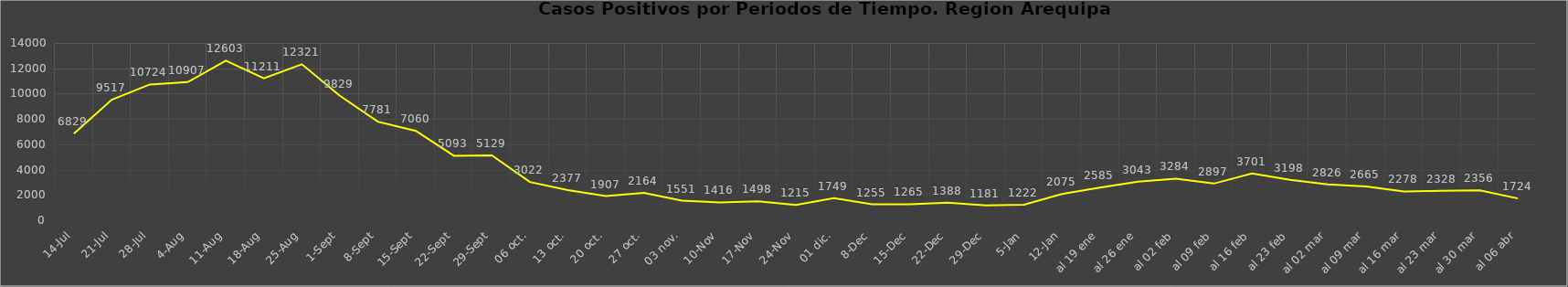
| Category | Series 1 |
|---|---|
| 14-Jul | 6829 |
| 21-Jul | 9517 |
| 28-Jul | 10724 |
| 4-Ago | 10907 |
| 11-Ago | 12603 |
| 18-Ago | 11211 |
| 25-Ago | 12321 |
| 1-Set | 9829 |
| 8-Set | 7781 |
| 15-Set | 7060 |
| 22-Set | 5093 |
| 29-Set | 5129 |
| 06 oct. | 3022 |
| 13 oct. | 2377 |
| 20 oct. | 1907 |
| 27 oct. | 2164 |
| 03 nov. | 1551 |
| 10-Nov | 1416 |
| 17-Nov | 1498 |
| 24-Nov | 1215 |
|  01 dic. | 1749 |
| 8-Dic | 1255 |
| 15-Dic | 1265 |
| 22-Dic | 1388 |
| 29-Dic | 1181 |
| 5-Ene | 1222 |
| 12-Ene | 2075 |
| al 19 ene | 2585 |
| al 26 ene | 3043 |
| al 02 feb | 3284 |
| al 09 feb | 2897 |
| al 16 feb | 3701 |
| al 23 feb | 3198 |
| al 02 mar | 2826 |
| al 09 mar | 2665 |
| al 16 mar | 2278 |
| al 23 mar | 2328 |
| al 30 mar | 2356 |
| al 06 abr | 1724 |